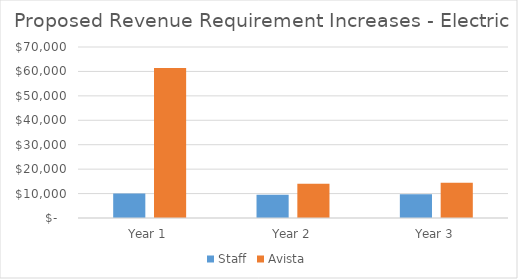
| Category | Staff | Avista |
|---|---|---|
| Year 1 | 10034.115 | 61356 |
| Year 2 | 9519.922 | 13983 |
| Year 3 | 9740.444 | 14432 |